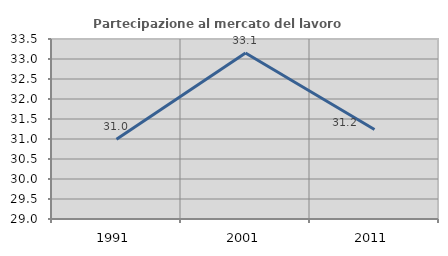
| Category | Partecipazione al mercato del lavoro  femminile |
|---|---|
| 1991.0 | 30.991 |
| 2001.0 | 33.148 |
| 2011.0 | 31.238 |